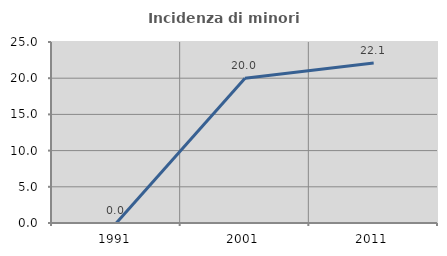
| Category | Incidenza di minori stranieri |
|---|---|
| 1991.0 | 0 |
| 2001.0 | 20 |
| 2011.0 | 22.101 |